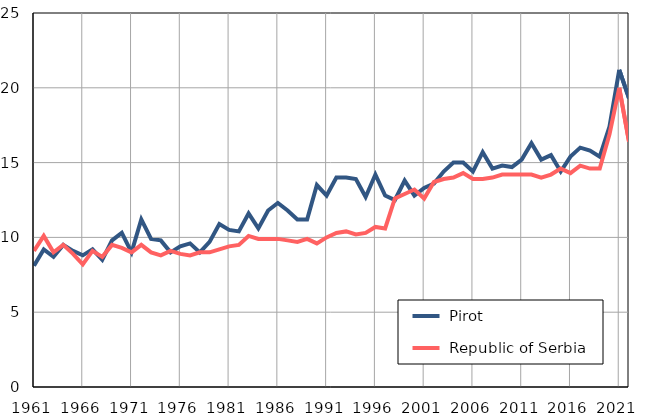
| Category |  Pirot |  Republic of Serbia |
|---|---|---|
| 1961.0 | 8.1 | 9.1 |
| 1962.0 | 9.2 | 10.1 |
| 1963.0 | 8.7 | 9 |
| 1964.0 | 9.5 | 9.5 |
| 1965.0 | 9.1 | 8.9 |
| 1966.0 | 8.8 | 8.2 |
| 1967.0 | 9.2 | 9.1 |
| 1968.0 | 8.5 | 8.7 |
| 1969.0 | 9.8 | 9.5 |
| 1970.0 | 10.3 | 9.3 |
| 1971.0 | 9 | 9 |
| 1972.0 | 11.2 | 9.5 |
| 1973.0 | 9.9 | 9 |
| 1974.0 | 9.8 | 8.8 |
| 1975.0 | 9 | 9.1 |
| 1976.0 | 9.4 | 8.9 |
| 1977.0 | 9.6 | 8.8 |
| 1978.0 | 9 | 9 |
| 1979.0 | 9.7 | 9 |
| 1980.0 | 10.9 | 9.2 |
| 1981.0 | 10.5 | 9.4 |
| 1982.0 | 10.4 | 9.5 |
| 1983.0 | 11.6 | 10.1 |
| 1984.0 | 10.6 | 9.9 |
| 1985.0 | 11.8 | 9.9 |
| 1986.0 | 12.3 | 9.9 |
| 1987.0 | 11.8 | 9.8 |
| 1988.0 | 11.2 | 9.7 |
| 1989.0 | 11.2 | 9.9 |
| 1990.0 | 13.5 | 9.6 |
| 1991.0 | 12.8 | 10 |
| 1992.0 | 14 | 10.3 |
| 1993.0 | 14 | 10.4 |
| 1994.0 | 13.9 | 10.2 |
| 1995.0 | 12.7 | 10.3 |
| 1996.0 | 14.2 | 10.7 |
| 1997.0 | 12.8 | 10.6 |
| 1998.0 | 12.5 | 12.6 |
| 1999.0 | 13.8 | 12.9 |
| 2000.0 | 12.8 | 13.2 |
| 2001.0 | 13.3 | 12.6 |
| 2002.0 | 13.6 | 13.7 |
| 2003.0 | 14.4 | 13.9 |
| 2004.0 | 15 | 14 |
| 2005.0 | 15 | 14.3 |
| 2006.0 | 14.4 | 13.9 |
| 2007.0 | 15.7 | 13.9 |
| 2008.0 | 14.6 | 14 |
| 2009.0 | 14.8 | 14.2 |
| 2010.0 | 14.7 | 14.2 |
| 2011.0 | 15.2 | 14.2 |
| 2012.0 | 16.3 | 14.2 |
| 2013.0 | 15.2 | 14 |
| 2014.0 | 15.5 | 14.2 |
| 2015.0 | 14.4 | 14.6 |
| 2016.0 | 15.4 | 14.3 |
| 2017.0 | 16 | 14.8 |
| 2018.0 | 15.8 | 14.6 |
| 2019.0 | 15.4 | 14.6 |
| 2020.0 | 17.4 | 16.9 |
| 2021.0 | 21.2 | 20 |
| 2022.0 | 19.3 | 16.4 |